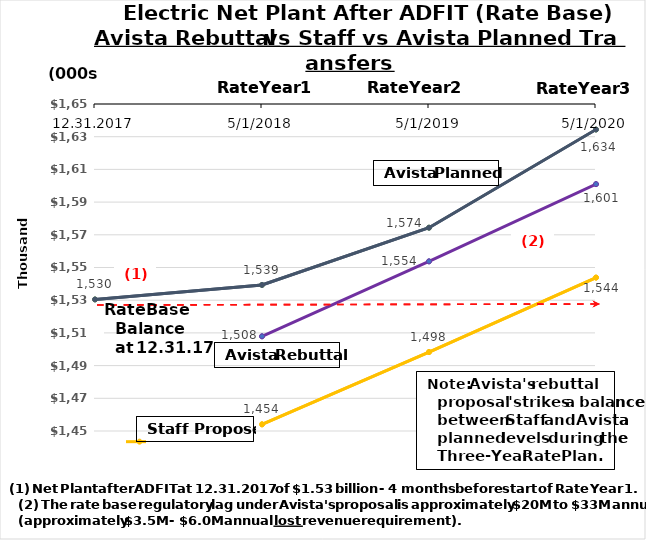
| Category | Staff | Avista Rebuttal | Avista Planned |
|---|---|---|---|
| 12.31.2017 | 1454074 | 1507919 | 1530469 |
| 5/1/2018 | 1454074 | 1507919 | 1539337 |
| 5/1/2019 | 1498277.85 | 1553759.738 | 1574348 |
| 5/1/2020 | 1543825.496 | 1600994.034 | 1634379 |